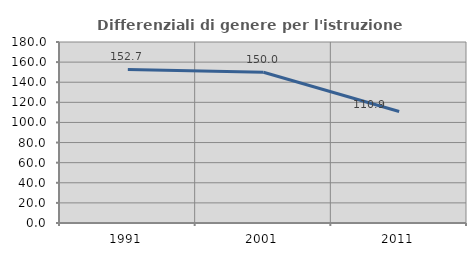
| Category | Differenziali di genere per l'istruzione superiore |
|---|---|
| 1991.0 | 152.722 |
| 2001.0 | 149.95 |
| 2011.0 | 110.921 |